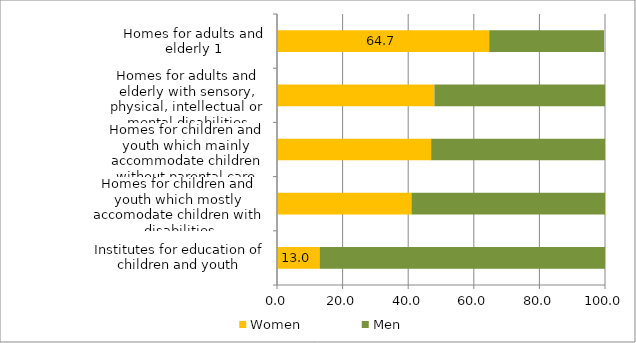
| Category | Women | Men |
|---|---|---|
| Institutes for education of children and youth | 13 | 87 |
| Homes for children and youth which mostly accomodate children with disabilities | 41 | 59 |
| Homes for children and youth which mainly accommodate children without parental care | 47 | 53 |
| Homes for adults and elderly with sensory, physical, intellectual or mental disabilities | 48 | 52 |
| Homes for adults and elderly 1 | 64.7 | 35 |